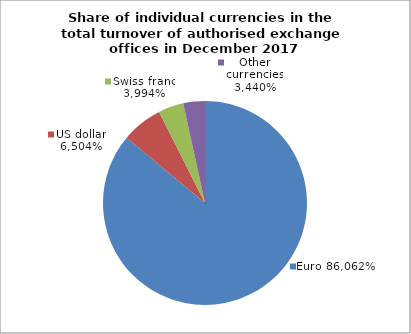
| Category | EUR |
|---|---|
| 0 | 0.861 |
| 1 | 0.065 |
| 2 | 0.04 |
| 3 | 0.034 |